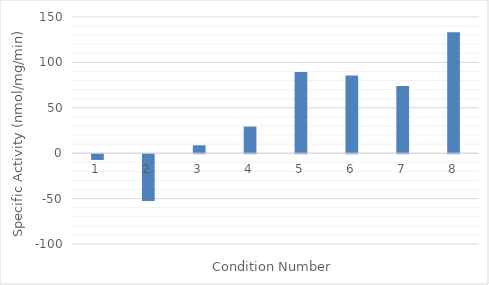
| Category | Specific Activity |
|---|---|
| 0 | -6.329 |
| 1 | -51.576 |
| 2 | 8.719 |
| 3 | 29.305 |
| 4 | 89.494 |
| 5 | 85.551 |
| 6 | 74.01 |
| 7 | 133.078 |